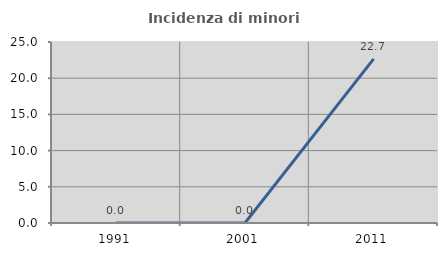
| Category | Incidenza di minori stranieri |
|---|---|
| 1991.0 | 0 |
| 2001.0 | 0 |
| 2011.0 | 22.667 |